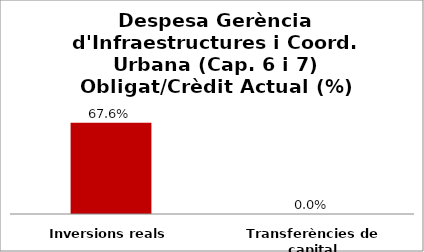
| Category | Series 0 |
|---|---|
| Inversions reals | 0.676 |
| Transferències de capital | 0 |